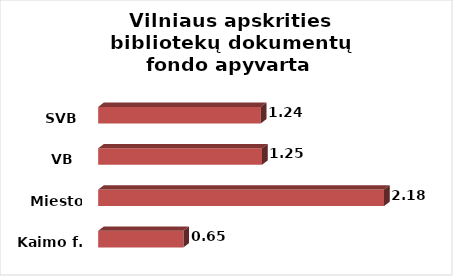
| Category | Series 0 |
|---|---|
| Kaimo f. | 0.65 |
| Miesto f. | 2.18 |
| VB  | 1.25 |
| SVB | 1.24 |